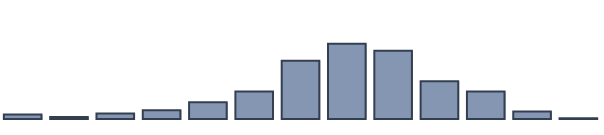
| Category | Series 0 |
|---|---|
| 0 | 1.3 |
| 1 | 0.6 |
| 2 | 1.6 |
| 3 | 2.6 |
| 4 | 4.9 |
| 5 | 8.1 |
| 6 | 17.1 |
| 7 | 22.1 |
| 8 | 20.1 |
| 9 | 11.1 |
| 10 | 8.1 |
| 11 | 2.2 |
| 12 | 0.2 |